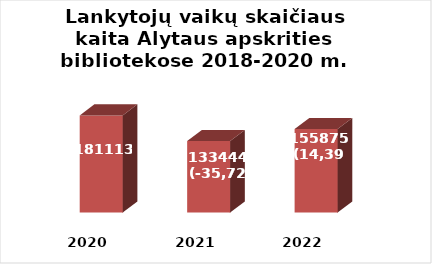
| Category | Series 0 |
|---|---|
| 2020.0 | 181113 |
| 2021.0 | 133444 |
| 2022.0 | 155875 |